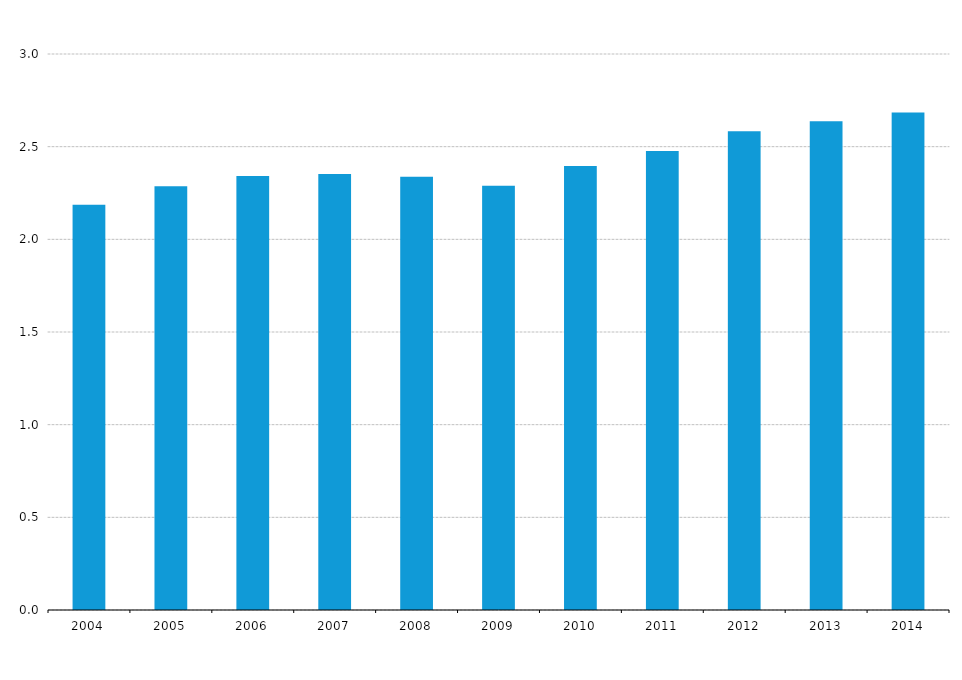
| Category | EU-28 |
|---|---|
| 2004.0 | 2.186 |
| 2005.0 | 2.286 |
| 2006.0 | 2.342 |
| 2007.0 | 2.352 |
| 2008.0 | 2.337 |
| 2009.0 | 2.289 |
| 2010.0 | 2.396 |
| 2011.0 | 2.476 |
| 2012.0 | 2.583 |
| 2013.0 | 2.637 |
| 2014.0 | 2.684 |